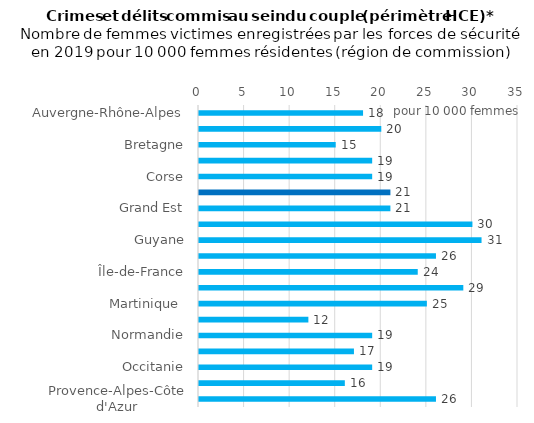
| Category | Series 0 |
|---|---|
| Auvergne-Rhône-Alpes | 18 |
| Bourgogne-Franche-Comté | 20 |
| Bretagne | 15 |
| Centre-Val de Loire | 19 |
| Corse | 19 |
| France métropolitaine | 21 |
| Grand Est | 21 |
| Guadeloupe  | 30 |
| Guyane | 31 |
| Hauts-de-France | 26 |
| Île-de-France | 24 |
| La Réunion | 29 |
| Martinique  | 25 |
| Mayotte | 12 |
| Normandie | 19 |
| Nouvelle-Aquitaine | 17 |
| Occitanie | 19 |
| Pays de la Loire | 16 |
| Provence-Alpes-Côte d'Azur | 26 |